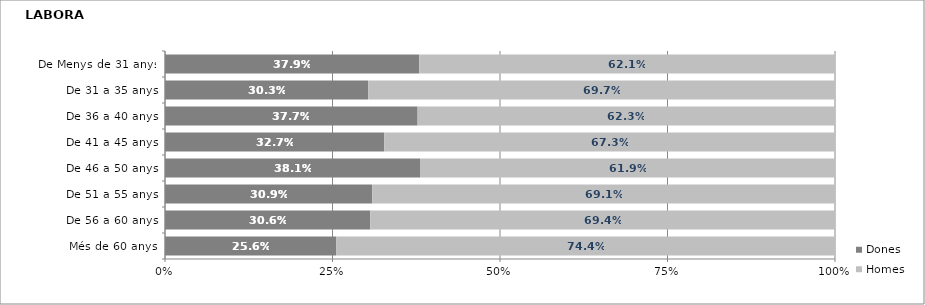
| Category | Dones | Homes |
|---|---|---|
| Més de 60 anys | 0.256 | 0.744 |
| De 56 a 60 anys | 0.306 | 0.694 |
| De 51 a 55 anys | 0.309 | 0.691 |
| De 46 a 50 anys | 0.381 | 0.619 |
| De 41 a 45 anys | 0.327 | 0.673 |
| De 36 a 40 anys | 0.377 | 0.623 |
| De 31 a 35 anys | 0.303 | 0.697 |
| De Menys de 31 anys | 0.379 | 0.621 |